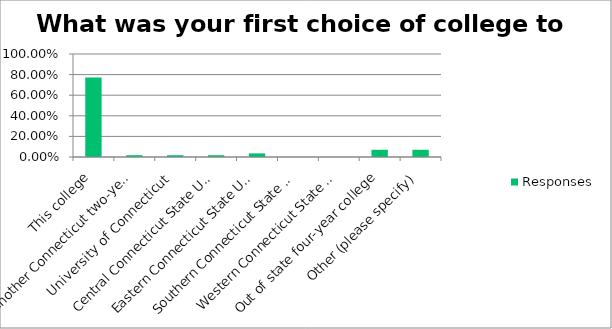
| Category | Responses |
|---|---|
| This college | 0.772 |
| Another Connecticut two-year college | 0.018 |
| University of Connecticut | 0.018 |
| Central Connecticut State University | 0.018 |
| Eastern Connecticut State University | 0.035 |
| Southern Connecticut State University | 0 |
| Western Connecticut State University | 0 |
| Out of state four-year college | 0.07 |
| Other (please specify) | 0.07 |